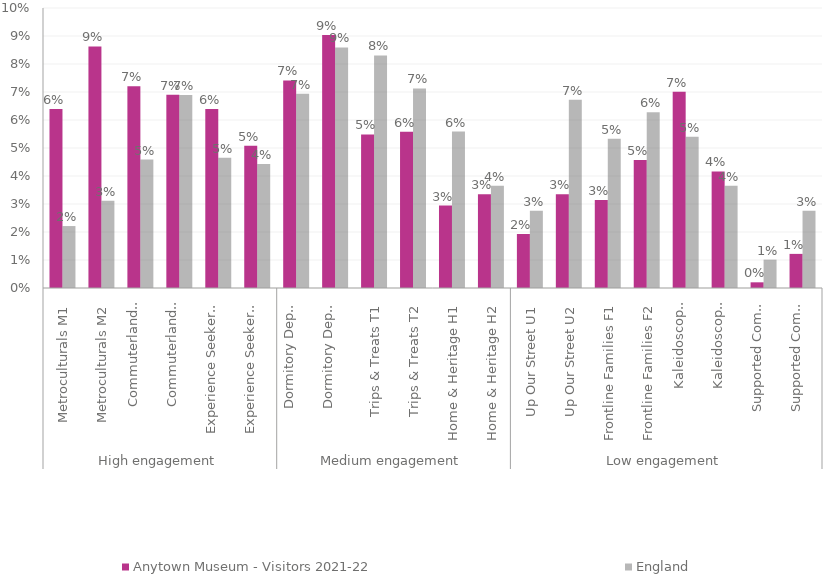
| Category | Anytown Museum - Visitors 2021-22 | England |
|---|---|---|
| 0 | 0.064 | 0.022 |
| 1 | 0.086 | 0.031 |
| 2 | 0.072 | 0.046 |
| 3 | 0.069 | 0.069 |
| 4 | 0.064 | 0.046 |
| 5 | 0.051 | 0.044 |
| 6 | 0.074 | 0.069 |
| 7 | 0.09 | 0.086 |
| 8 | 0.055 | 0.083 |
| 9 | 0.056 | 0.071 |
| 10 | 0.029 | 0.056 |
| 11 | 0.034 | 0.037 |
| 12 | 0.019 | 0.028 |
| 13 | 0.034 | 0.067 |
| 14 | 0.031 | 0.053 |
| 15 | 0.046 | 0.063 |
| 16 | 0.07 | 0.054 |
| 17 | 0.042 | 0.037 |
| 18 | 0.002 | 0.01 |
| 19 | 0.012 | 0.028 |